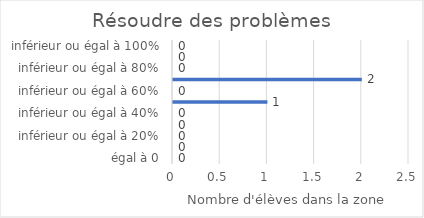
| Category | Résoudre des problèmes |
|---|---|
| égal à 0 | 0 |
| inférieur ou égal à 10% | 0 |
| inférieur ou égal à 20% | 0 |
| inférieur ou égal à 30% | 0 |
| inférieur ou égal à 40% | 0 |
| inférieur ou égal à 50% | 1 |
| inférieur ou égal à 60% | 0 |
| inférieur ou égal à 70% | 2 |
| inférieur ou égal à 80% | 0 |
| inférieur ou égal à 90% | 0 |
| inférieur ou égal à 100% | 0 |